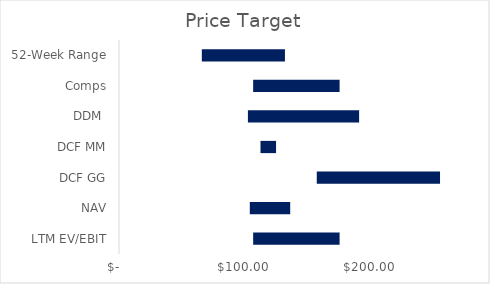
| Category | Series 0 | Series 1 | Series 2 |
|---|---|---|---|
| LTM EV/EBIT | 106.932 | 69.049 | 175.98 |
| NAV | 104.267 | 32.4 | 136.667 |
| DCF GG | 157.64 | 98.34 | 255.98 |
| DCF MM | 112.78 | 12.54 | 125.32 |
| DDM  | 102.76 | 88.81 | 191.57 |
| Comps | 106.93 | 69.05 | 175.98 |
| 52-Week Range | 66.01 | 66.29 | 132.3 |